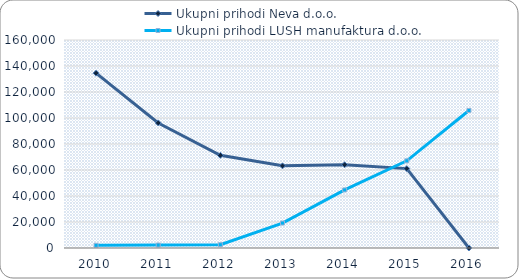
| Category | Ukupni prihodi Neva d.o.o. | Ukupni prihodi LUSH manufaktura d.o.o. |
|---|---|---|
| 2010.0 | 134489 | 2060 |
| 2011.0 | 96182 | 2264 |
| 2012.0 | 71272 | 2544 |
| 2013.0 | 63195 | 19195 |
| 2014.0 | 64044 | 44673 |
| 2015.0 | 61076 | 67054 |
| 2016.0 | 0 | 105791 |